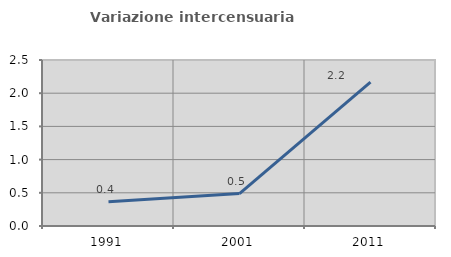
| Category | Variazione intercensuaria annua |
|---|---|
| 1991.0 | 0.367 |
| 2001.0 | 0.489 |
| 2011.0 | 2.167 |